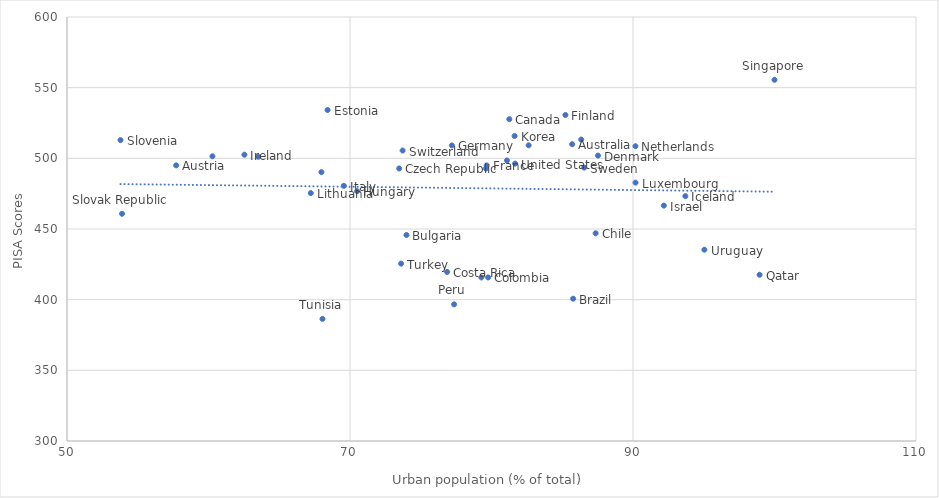
| Category | Series 0 |
|---|---|
| 85.701 | 509.994 |
| 57.715 | 495.037 |
| 85.77 | 400.682 |
| 73.99 | 445.772 |
| 81.259 | 527.705 |
| 87.36 | 446.956 |
| 79.764 | 415.729 |
| 76.862 | 419.608 |
| 73.477 | 492.83 |
| 87.526 | 501.937 |
| 68.416 | 534.194 |
| 85.225 | 530.661 |
| 79.655 | 494.978 |
| 77.2 | 509.141 |
| 70.5 | 476.748 |
| 93.7 | 473.23 |
| 62.538 | 502.575 |
| 92.179 | 466.553 |
| 69.565 | 480.547 |
| 81.634 | 515.81 |
| 67.98 | 490.225 |
| 67.23 | 475.409 |
| 90.179 | 482.806 |
| 79.285 | 415.71 |
| 90.173 | 508.575 |
| 86.341 | 513.304 |
| 81.091 | 498.481 |
| 77.357 | 396.684 |
| 60.278 | 501.435 |
| 63.514 | 501.1 |
| 98.945 | 417.611 |
| 100.0 | 555.575 |
| 53.889 | 460.775 |
| 53.781 | 512.864 |
| 79.602 | 492.786 |
| 86.553 | 493.422 |
| 73.718 | 505.506 |
| 68.056 | 386.403 |
| 73.611 | 425.49 |
| 82.626 | 509.222 |
| 81.671 | 496.242 |
| 95.045 | 435.363 |